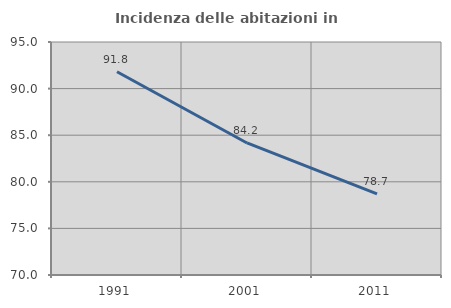
| Category | Incidenza delle abitazioni in proprietà  |
|---|---|
| 1991.0 | 91.81 |
| 2001.0 | 84.167 |
| 2011.0 | 78.696 |